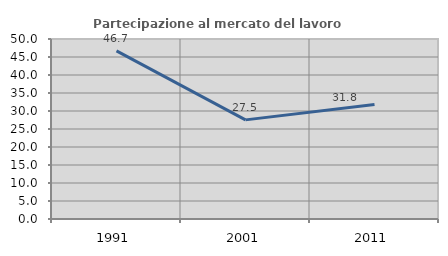
| Category | Partecipazione al mercato del lavoro  femminile |
|---|---|
| 1991.0 | 46.714 |
| 2001.0 | 27.535 |
| 2011.0 | 31.829 |